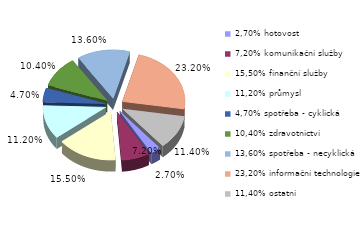
| Category | Series 0 |
|---|---|
| 2,70% hotovost | 0.027 |
| 7,20% komunikační služby | 0.072 |
| 15,50% finanční služby | 0.155 |
| 11,20% průmysl | 0.112 |
| 4,70% spotřeba - cyklická | 0.047 |
| 10,40% zdravotnictví | 0.104 |
| 13,60% spotřeba - necyklická | 0.136 |
| 23,20% informační technologie | 0.232 |
| 11,40% ostatní | 0.114 |